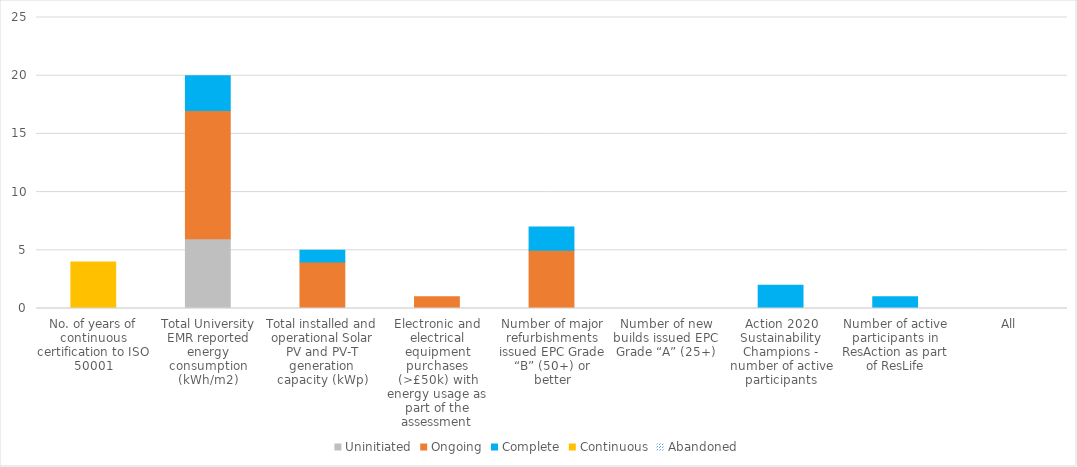
| Category | Uninitiated | Ongoing | Complete | Continuous | Abandoned |
|---|---|---|---|---|---|
| No. of years of continuous certification to ISO 50001 | 0 | 0 | 0 | 4 | 0 |
| Total University EMR reported energy consumption (kWh/m2) | 6 | 11 | 3 | 0 | 0 |
| Total installed and operational Solar PV and PV-T generation capacity (kWp) | 0 | 4 | 1 | 0 | 0 |
| Electronic and electrical equipment purchases (>£50k) with energy usage as part of the assessment | 0 | 1 | 0 | 0 | 0 |
| Number of major refurbishments issued EPC Grade “B” (50+) or better | 0 | 5 | 2 | 0 | 0 |
| Number of new builds issued EPC Grade “A” (25+) | 0 | 0 | 0 | 0 | 0 |
| Action 2020 Sustainability Champions - number of active participants | 0 | 0 | 2 | 0 | 0 |
| Number of active participants in ResAction as part of ResLife | 0 | 0 | 1 | 0 | 0 |
| All | 0 | 0 | 0 | 0 | 0 |